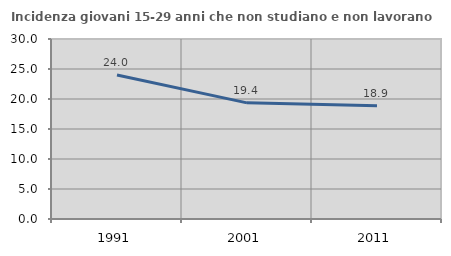
| Category | Incidenza giovani 15-29 anni che non studiano e non lavorano  |
|---|---|
| 1991.0 | 23.991 |
| 2001.0 | 19.355 |
| 2011.0 | 18.889 |